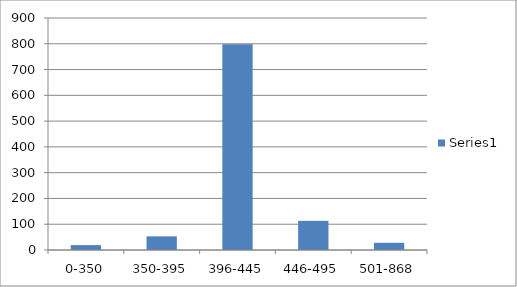
| Category | Series 0 |
|---|---|
| 0-350 | 19 |
| 350-395 | 53 |
| 396-445 | 798 |
| 446-495 | 113 |
| 501-868 | 28 |